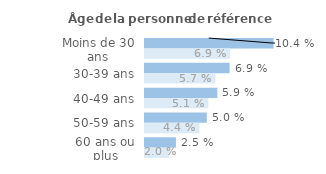
| Category | Series 1 | Series 0 |
|---|---|---|
| Moins de 30 ans | 0.104 | 0.069 |
| 30-39 ans | 0.069 | 0.057 |
| 40-49 ans | 0.059 | 0.051 |
| 50-59 ans | 0.05 | 0.044 |
| 60 ans ou plus | 0.025 | 0.02 |